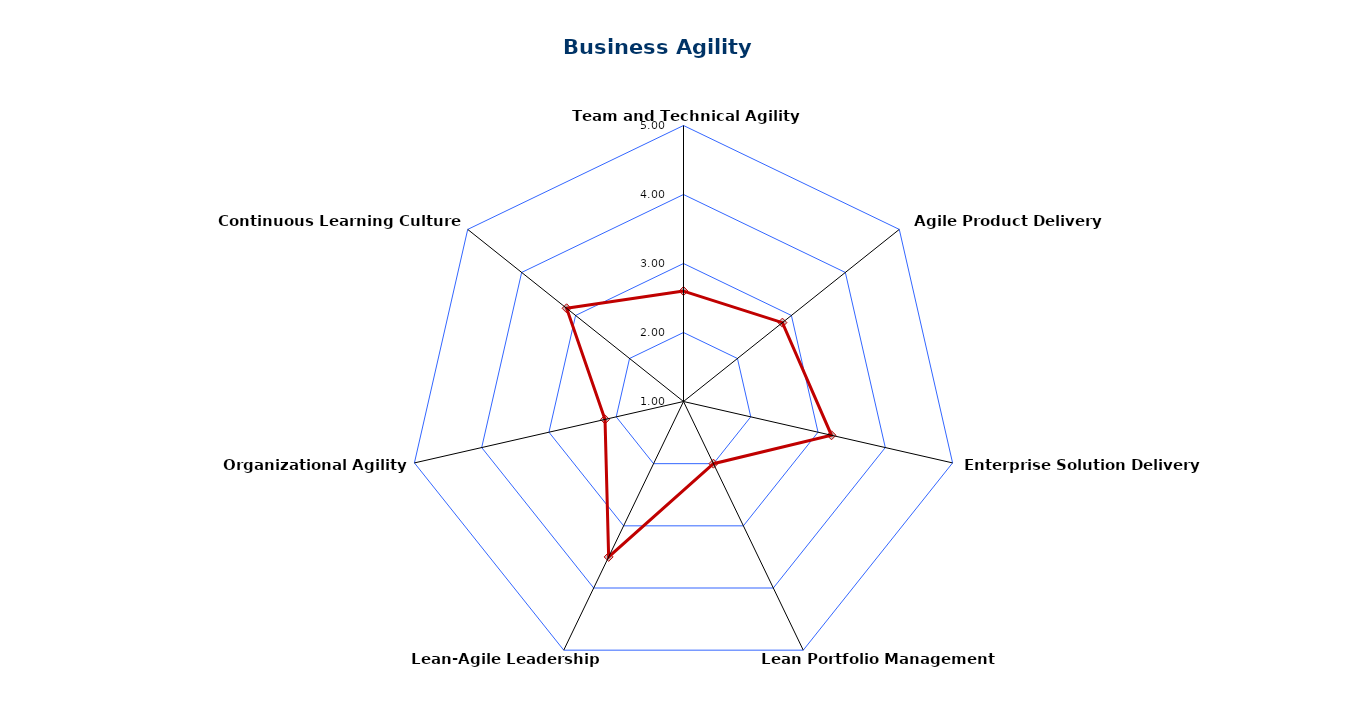
| Category | BA Assessment |
|---|---|
| Team and Technical Agility (TTA) | 2.6 |
| Agile Product Delivery (APD) | 2.833 |
| Enterprise Solution Delivery (ESD) | 3.2 |
| Lean Portfolio Management (LPM) | 2 |
| Lean-Agile Leadership (LAL) | 3.5 |
| Organizational Agility (OA) | 2.167 |
| Continuous Learning Culture (CLC) | 3.167 |